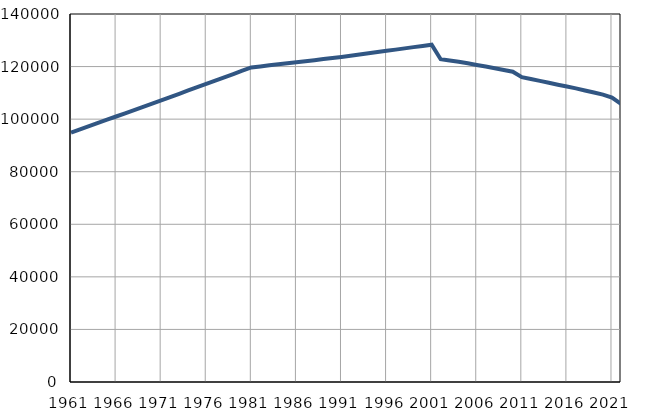
| Category | Population
size |
|---|---|
| 1961.0 | 94866 |
| 1962.0 | 96094 |
| 1963.0 | 97321 |
| 1964.0 | 98549 |
| 1965.0 | 99777 |
| 1966.0 | 101005 |
| 1967.0 | 102232 |
| 1968.0 | 103460 |
| 1969.0 | 104688 |
| 1970.0 | 105915 |
| 1971.0 | 107143 |
| 1972.0 | 108396 |
| 1973.0 | 109648 |
| 1974.0 | 110901 |
| 1975.0 | 112153 |
| 1976.0 | 113405 |
| 1977.0 | 114659 |
| 1978.0 | 115911 |
| 1979.0 | 117164 |
| 1980.0 | 118416 |
| 1981.0 | 119669 |
| 1982.0 | 120065 |
| 1983.0 | 120462 |
| 1984.0 | 120858 |
| 1985.0 | 121255 |
| 1986.0 | 121650 |
| 1987.0 | 122047 |
| 1988.0 | 122444 |
| 1989.0 | 122840 |
| 1990.0 | 123237 |
| 1991.0 | 123633 |
| 1992.0 | 124103 |
| 1993.0 | 124573 |
| 1994.0 | 125042 |
| 1995.0 | 125512 |
| 1996.0 | 125982 |
| 1997.0 | 126452 |
| 1998.0 | 126922 |
| 1999.0 | 127392 |
| 2000.0 | 127861 |
| 2001.0 | 128331 |
| 2002.0 | 122792 |
| 2003.0 | 122313 |
| 2004.0 | 121869 |
| 2005.0 | 121287 |
| 2006.0 | 120626 |
| 2007.0 | 120000 |
| 2008.0 | 119386 |
| 2009.0 | 118720 |
| 2010.0 | 118040 |
| 2011.0 | 115972 |
| 2012.0 | 115287 |
| 2013.0 | 114548 |
| 2014.0 | 113827 |
| 2015.0 | 113113 |
| 2016.0 | 112414 |
| 2017.0 | 111709 |
| 2018.0 | 110918 |
| 2019.0 | 110148 |
| 2020.0 | 109340 |
| 2021.0 | 108187 |
| 2022.0 | 105768 |